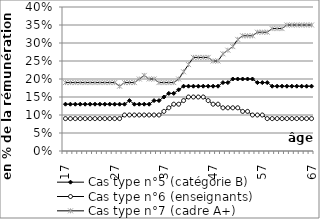
| Category | Cas type n°5 (catégorie B) | Cas type n°6 (enseignants) | Cas type n°7 (cadre A+) |
|---|---|---|---|
| 17.0 | 0.13 | 0.09 | 0.19 |
| 18.0 | 0.13 | 0.09 | 0.19 |
| 19.0 | 0.13 | 0.09 | 0.19 |
| 20.0 | 0.13 | 0.09 | 0.19 |
| 21.0 | 0.13 | 0.09 | 0.19 |
| 22.0 | 0.13 | 0.09 | 0.19 |
| 23.0 | 0.13 | 0.09 | 0.19 |
| 24.0 | 0.13 | 0.09 | 0.19 |
| 25.0 | 0.13 | 0.09 | 0.19 |
| 26.0 | 0.13 | 0.09 | 0.19 |
| 27.0 | 0.13 | 0.09 | 0.19 |
| 28.0 | 0.13 | 0.09 | 0.18 |
| 29.0 | 0.13 | 0.1 | 0.19 |
| 30.0 | 0.14 | 0.1 | 0.19 |
| 31.0 | 0.13 | 0.1 | 0.19 |
| 32.0 | 0.13 | 0.1 | 0.2 |
| 33.0 | 0.13 | 0.1 | 0.21 |
| 34.0 | 0.13 | 0.1 | 0.2 |
| 35.0 | 0.14 | 0.1 | 0.2 |
| 36.0 | 0.14 | 0.1 | 0.19 |
| 37.0 | 0.15 | 0.11 | 0.19 |
| 38.0 | 0.16 | 0.12 | 0.19 |
| 39.0 | 0.16 | 0.13 | 0.19 |
| 40.0 | 0.17 | 0.13 | 0.2 |
| 41.0 | 0.18 | 0.14 | 0.22 |
| 42.0 | 0.18 | 0.15 | 0.24 |
| 43.0 | 0.18 | 0.15 | 0.26 |
| 44.0 | 0.18 | 0.15 | 0.26 |
| 45.0 | 0.18 | 0.15 | 0.26 |
| 46.0 | 0.18 | 0.14 | 0.26 |
| 47.0 | 0.18 | 0.13 | 0.25 |
| 48.0 | 0.18 | 0.13 | 0.25 |
| 49.0 | 0.19 | 0.12 | 0.27 |
| 50.0 | 0.19 | 0.12 | 0.28 |
| 51.0 | 0.2 | 0.12 | 0.29 |
| 52.0 | 0.2 | 0.12 | 0.31 |
| 53.0 | 0.2 | 0.11 | 0.32 |
| 54.0 | 0.2 | 0.11 | 0.32 |
| 55.0 | 0.2 | 0.1 | 0.32 |
| 56.0 | 0.19 | 0.1 | 0.33 |
| 57.0 | 0.19 | 0.1 | 0.33 |
| 58.0 | 0.19 | 0.09 | 0.33 |
| 59.0 | 0.18 | 0.09 | 0.34 |
| 60.0 | 0.18 | 0.09 | 0.34 |
| 61.0 | 0.18 | 0.09 | 0.34 |
| 62.0 | 0.18 | 0.09 | 0.35 |
| 63.0 | 0.18 | 0.09 | 0.35 |
| 64.0 | 0.18 | 0.09 | 0.35 |
| 65.0 | 0.18 | 0.09 | 0.35 |
| 66.0 | 0.18 | 0.09 | 0.35 |
| 67.0 | 0.18 | 0.09 | 0.35 |